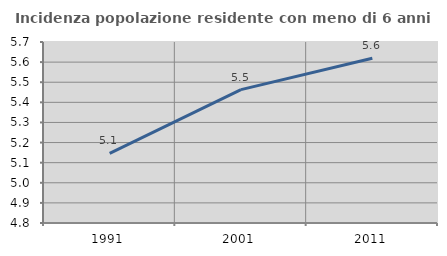
| Category | Incidenza popolazione residente con meno di 6 anni |
|---|---|
| 1991.0 | 5.146 |
| 2001.0 | 5.463 |
| 2011.0 | 5.619 |